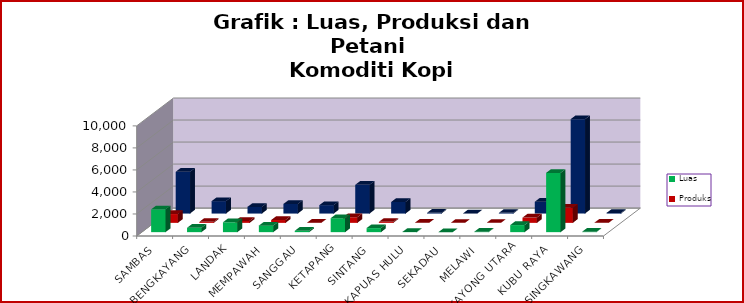
| Category | Luas | Produksi | Petani |
|---|---|---|---|
| SAMBAS | 2070 | 800 | 3795 |
| BENGKAYANG | 396 | 90 | 1129 |
| LANDAK | 897 | 180 | 607 |
| MEMPAWAH | 591 | 257 | 873 |
| SANGGAU | 124 | 15 | 765 |
| KETAPANG | 1266 | 509 | 2614 |
| SINTANG | 368 | 91 | 1050 |
| KAPUAS HULU | 23 | 4 | 68 |
| SEKADAU | 1 | 0.2 | 10 |
| MELAWI | 37 | 1 | 65 |
| KAYONG UTARA | 643 | 480 | 1075 |
| KUBU RAYA | 5382 | 1369 | 8575 |
| SINGKAWANG | 29 | 6 | 62 |